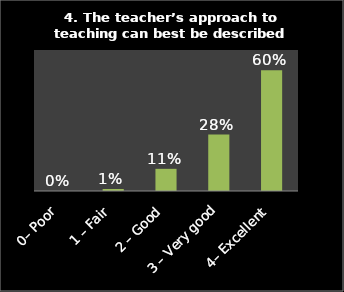
| Category | Series 0 |
|---|---|
| 0– Poor | 0 |
| 1 – Fair | 0.01 |
| 2 – Good | 0.11 |
| 3 – Very good | 0.28 |
| 4– Excellent | 0.6 |